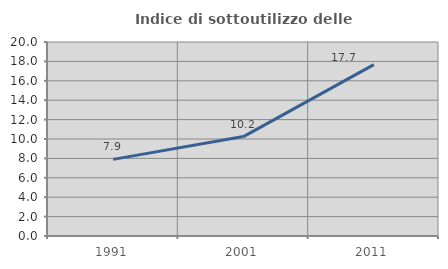
| Category | Indice di sottoutilizzo delle abitazioni  |
|---|---|
| 1991.0 | 7.901 |
| 2001.0 | 10.247 |
| 2011.0 | 17.669 |